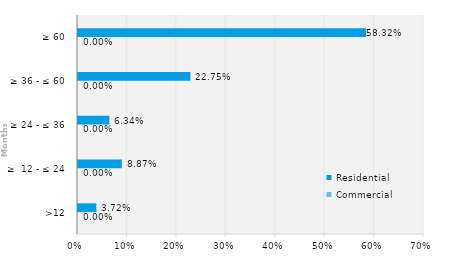
| Category | Commercial | Residential |
|---|---|---|
| >12 | 0 | 0.037 |
| ≥  12 - ≤ 24 | 0 | 0.089 |
| ≥ 24 - ≤ 36 | 0 | 0.063 |
| ≥ 36 - ≤ 60 | 0 | 0.227 |
| ≥ 60 | 0 | 0.583 |